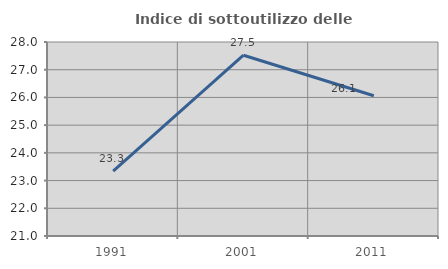
| Category | Indice di sottoutilizzo delle abitazioni  |
|---|---|
| 1991.0 | 23.342 |
| 2001.0 | 27.523 |
| 2011.0 | 26.061 |